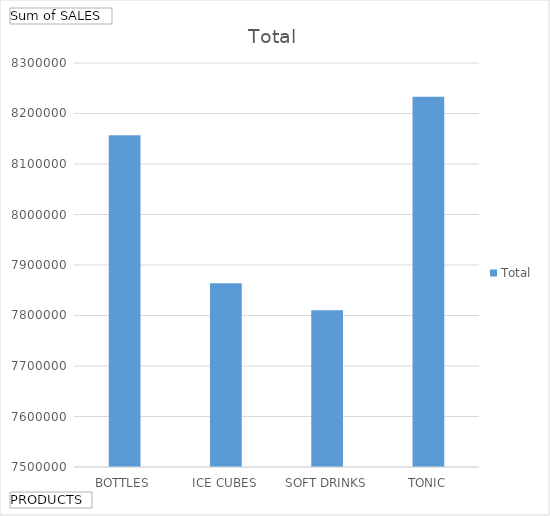
| Category | Total |
|---|---|
| BOTTLES | 8157178 |
| ICE CUBES | 7863700 |
| SOFT DRINKS | 7810473 |
| TONIC | 8232981 |